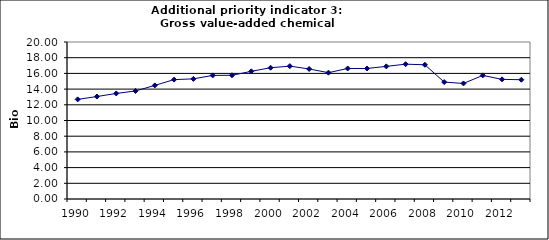
| Category | Gross value-added chemical industry, Bio Euro (EC95) |
|---|---|
| 1990 | 12.69 |
| 1991 | 13.052 |
| 1992 | 13.446 |
| 1993 | 13.761 |
| 1994 | 14.469 |
| 1995 | 15.209 |
| 1996 | 15.304 |
| 1997 | 15.745 |
| 1998 | 15.76 |
| 1999 | 16.264 |
| 2000 | 16.721 |
| 2001 | 16.925 |
| 2002 | 16.563 |
| 2003 | 16.091 |
| 2004 | 16.626 |
| 2005 | 16.626 |
| 2006 | 16.894 |
| 2007 | 17.177 |
| 2008 | 17.099 |
| 2009 | 14.894 |
| 2010 | 14.721 |
| 2011 | 15.745 |
| 2012 | 15.241 |
| 2013 | 15.194 |